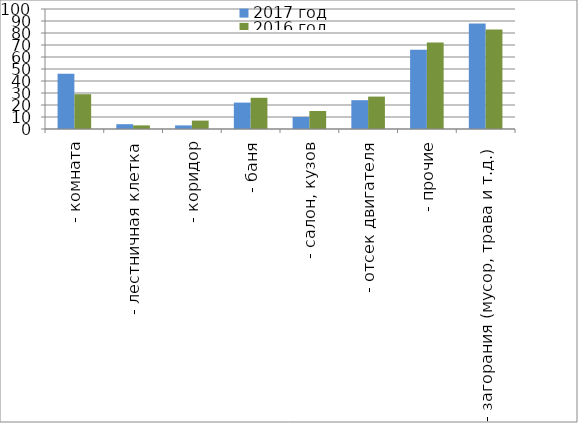
| Category | 2017 год | 2016 год |
|---|---|---|
|  - комната | 46 | 29 |
|  - лестничная клетка | 4 | 3 |
|  - коридор | 3 | 7 |
|  - баня | 22 | 26 |
|  - салон, кузов | 10 | 15 |
|  - отсек двигателя | 24 | 27 |
| - прочие | 66 | 72 |
| - загорания (мусор, трава и т.д.)  | 88 | 83 |